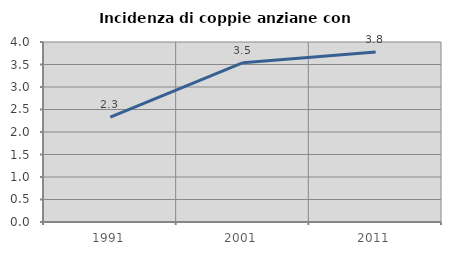
| Category | Incidenza di coppie anziane con figli |
|---|---|
| 1991.0 | 2.328 |
| 2001.0 | 3.541 |
| 2011.0 | 3.777 |